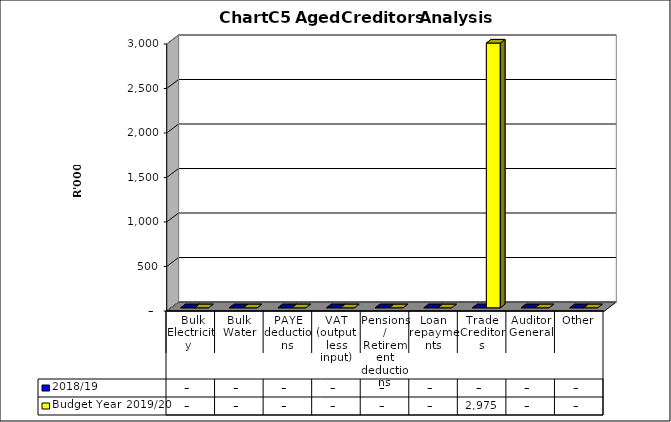
| Category | 2018/19 | Budget Year 2019/20 |
|---|---|---|
|  Bulk Electricity  | 0 | 0 |
| Bulk Water | 0 | 0 |
| PAYE deductions | 0 | 0 |
| VAT (output less input) | 0 | 0 |
| Pensions / Retirement deductions | 0 | 0 |
| Loan repayments | 0 | 0 |
| Trade Creditors | 0 | 2974791 |
| Auditor General | 0 | 0 |
| Other | 0 | 0 |